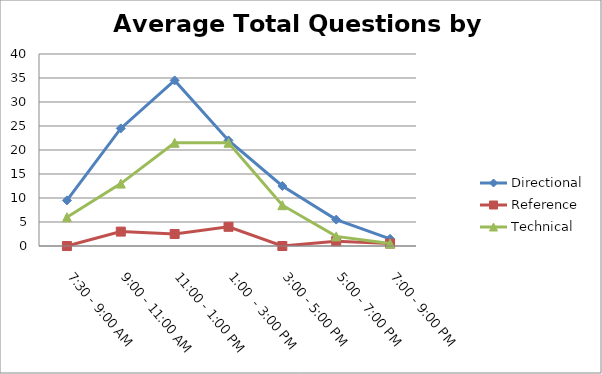
| Category | Directional | Reference | Technical |
|---|---|---|---|
| 7:30 - 9:00 AM | 9.5 | 0 | 6 |
| 9:00 - 11:00 AM | 24.5 | 3 | 13 |
| 11:00 - 1:00 PM | 34.5 | 2.5 | 21.5 |
| 1:00  - 3:00 PM | 22 | 4 | 21.5 |
| 3:00 - 5:00 PM | 12.5 | 0 | 8.5 |
| 5:00 - 7:00 PM | 5.5 | 1 | 2 |
| 7:00 - 9:00 PM | 1.5 | 0.5 | 0.5 |